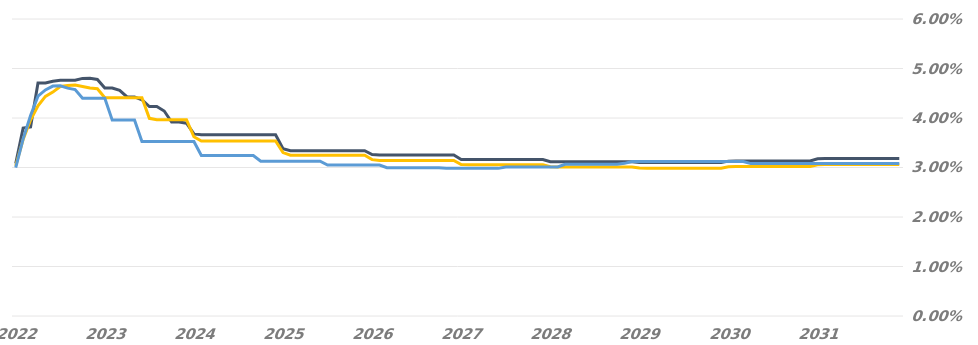
| Category | Resets |
|---|---|
| 2022-09-26 | 0.03 |
| 2022-10-26 | 0.036 |
| 2022-11-26 | 0.04 |
| 2022-12-26 | 0.044 |
| 2023-01-26 | 0.046 |
| 2023-02-26 | 0.046 |
| 2023-03-26 | 0.046 |
| 2023-04-26 | 0.046 |
| 2023-05-26 | 0.046 |
| 2023-06-26 | 0.044 |
| 2023-07-26 | 0.044 |
| 2023-08-26 | 0.044 |
| 2023-09-26 | 0.044 |
| 2023-10-26 | 0.04 |
| 2023-11-26 | 0.04 |
| 2023-12-26 | 0.04 |
| 2024-01-26 | 0.04 |
| 2024-02-26 | 0.035 |
| 2024-03-26 | 0.035 |
| 2024-04-26 | 0.035 |
| 2024-05-26 | 0.035 |
| 2024-06-26 | 0.035 |
| 2024-07-26 | 0.035 |
| 2024-08-26 | 0.035 |
| 2024-09-26 | 0.035 |
| 2024-10-26 | 0.032 |
| 2024-11-26 | 0.032 |
| 2024-12-26 | 0.032 |
| 2025-01-26 | 0.032 |
| 2025-02-26 | 0.032 |
| 2025-03-26 | 0.032 |
| 2025-04-26 | 0.032 |
| 2025-05-26 | 0.032 |
| 2025-06-26 | 0.031 |
| 2025-07-26 | 0.031 |
| 2025-08-26 | 0.031 |
| 2025-09-26 | 0.031 |
| 2025-10-26 | 0.031 |
| 2025-11-26 | 0.031 |
| 2025-12-26 | 0.031 |
| 2026-01-26 | 0.031 |
| 2026-02-26 | 0.031 |
| 2026-03-26 | 0.03 |
| 2026-04-26 | 0.03 |
| 2026-05-26 | 0.03 |
| 2026-06-26 | 0.03 |
| 2026-07-26 | 0.03 |
| 2026-08-26 | 0.03 |
| 2026-09-26 | 0.03 |
| 2026-10-26 | 0.03 |
| 2026-11-26 | 0.03 |
| 2026-12-26 | 0.03 |
| 2027-01-26 | 0.03 |
| 2027-02-26 | 0.03 |
| 2027-03-26 | 0.03 |
| 2027-04-26 | 0.03 |
| 2027-05-26 | 0.03 |
| 2027-06-26 | 0.03 |
| 2027-07-26 | 0.03 |
| 2027-08-26 | 0.03 |
| 2027-09-26 | 0.03 |
| 2027-10-26 | 0.03 |
| 2027-11-26 | 0.03 |
| 2027-12-26 | 0.03 |
| 2028-01-26 | 0.03 |
| 2028-02-26 | 0.03 |
| 2028-03-26 | 0.03 |
| 2028-04-26 | 0.03 |
| 2028-05-26 | 0.03 |
| 2028-06-26 | 0.03 |
| 2028-07-26 | 0.03 |
| 2028-08-26 | 0.03 |
| 2028-09-26 | 0.03 |
| 2028-10-26 | 0.03 |
| 2028-11-26 | 0.031 |
| 2028-12-26 | 0.031 |
| 2029-01-26 | 0.031 |
| 2029-02-26 | 0.031 |
| 2029-03-26 | 0.031 |
| 2029-04-26 | 0.031 |
| 2029-05-26 | 0.031 |
| 2029-06-26 | 0.031 |
| 2029-07-26 | 0.031 |
| 2029-08-26 | 0.031 |
| 2029-09-26 | 0.031 |
| 2029-10-26 | 0.031 |
| 2029-11-26 | 0.031 |
| 2029-12-26 | 0.031 |
| 2030-01-26 | 0.031 |
| 2030-02-26 | 0.031 |
| 2030-03-26 | 0.031 |
| 2030-04-26 | 0.031 |
| 2030-05-26 | 0.031 |
| 2030-06-26 | 0.031 |
| 2030-07-26 | 0.031 |
| 2030-08-26 | 0.031 |
| 2030-09-26 | 0.031 |
| 2030-10-26 | 0.031 |
| 2030-11-26 | 0.031 |
| 2030-12-26 | 0.031 |
| 2031-01-26 | 0.031 |
| 2031-02-26 | 0.031 |
| 2031-03-26 | 0.031 |
| 2031-04-26 | 0.031 |
| 2031-05-26 | 0.031 |
| 2031-06-26 | 0.031 |
| 2031-07-26 | 0.031 |
| 2031-08-26 | 0.031 |
| 2031-09-26 | 0.031 |
| 2031-10-26 | 0.031 |
| 2031-11-26 | 0.031 |
| 2031-12-26 | 0.031 |
| 2032-01-26 | 0.031 |
| 2032-02-26 | 0.031 |
| 2032-03-26 | 0.031 |
| 2032-04-26 | 0.031 |
| 2032-05-26 | 0.031 |
| 2032-06-26 | 0.031 |
| 2032-07-26 | 0.031 |
| 2032-08-26 | 0.031 |